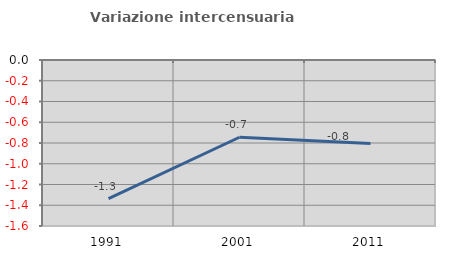
| Category | Variazione intercensuaria annua |
|---|---|
| 1991.0 | -1.336 |
| 2001.0 | -0.744 |
| 2011.0 | -0.804 |